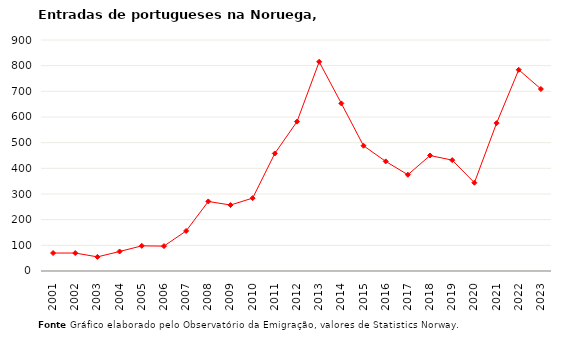
| Category | Entradas |
|---|---|
| 2001.0 | 70 |
| 2002.0 | 70 |
| 2003.0 | 55 |
| 2004.0 | 76 |
| 2005.0 | 98 |
| 2006.0 | 97 |
| 2007.0 | 156 |
| 2008.0 | 271 |
| 2009.0 | 257 |
| 2010.0 | 284 |
| 2011.0 | 458 |
| 2012.0 | 582 |
| 2013.0 | 815 |
| 2014.0 | 653 |
| 2015.0 | 488 |
| 2016.0 | 427 |
| 2017.0 | 375 |
| 2018.0 | 450 |
| 2019.0 | 432 |
| 2020.0 | 344 |
| 2021.0 | 576 |
| 2022.0 | 784 |
| 2023.0 | 709 |